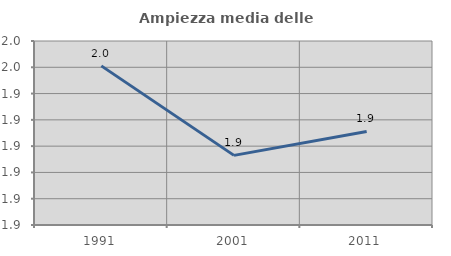
| Category | Ampiezza media delle famiglie |
|---|---|
| 1991.0 | 1.951 |
| 2001.0 | 1.916 |
| 2011.0 | 1.926 |